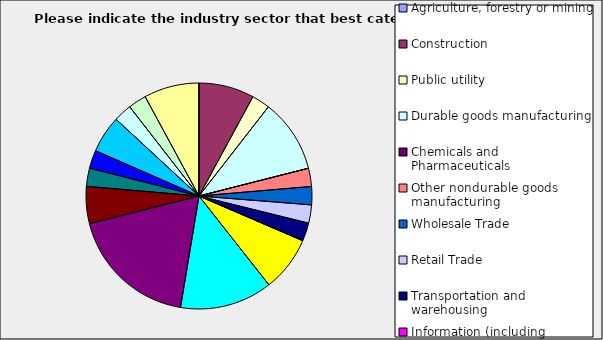
| Category | Series 0 |
|---|---|
| Agriculture, forestry or mining | 0 |
| Construction | 0.079 |
| Public utility | 0.026 |
| Durable goods manufacturing | 0.105 |
| Chemicals and Pharmaceuticals | 0 |
| Other nondurable goods manufacturing | 0.026 |
| Wholesale Trade | 0.026 |
| Retail Trade | 0.026 |
| Transportation and warehousing | 0.026 |
| Information (including broadcasting and telecommunication) | 0 |
| Finance and Insurance | 0.079 |
| Real Estate | 0.132 |
| Professional, scientific and technical services | 0.184 |
| Consulting | 0.053 |
| Administrative and office services (including waste management) | 0.026 |
| Education | 0.026 |
| Health Care and social services | 0.053 |
| Arts, entertainment and recreation | 0.026 |
| Accommodation and food services | 0.026 |
| Other | 0.079 |